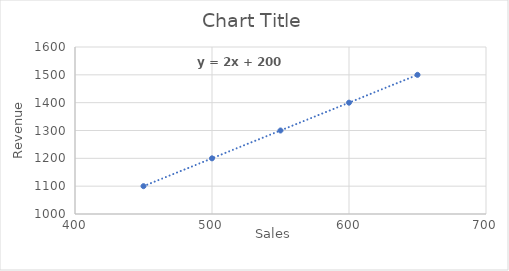
| Category | Series 0 |
|---|---|
| 500.0 | 1200 |
| 550.0 | 1300 |
| 450.0 | 1100 |
| 600.0 | 1400 |
| 650.0 | 1500 |